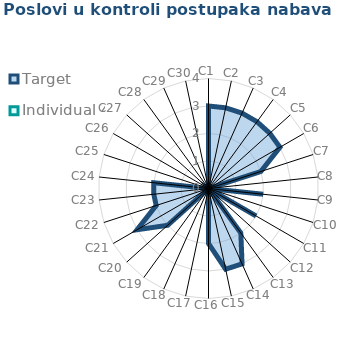
| Category | Target | Individual 4 |
|---|---|---|
| C1 | 3 | 0 |
| C2 | 3 | 0 |
| C3 | 3 | 0 |
| C4 | 3 | 0 |
| C5 | 3 | 0 |
| C6 | 3 | 0 |
| C7 | 2 | 0 |
| C8 | 0 | 0 |
| C9 | 2 | 0 |
| C10 | 0 | 0 |
| C11 | 2 | 0 |
| C12 | 0 | 0 |
| C13 | 2 | 0 |
| C14 | 3 | 0 |
| C15 | 3 | 0 |
| C16 | 2 | 0 |
| C17 | 0 | 0 |
| C18 | 0 | 0 |
| C19 | 0 | 0 |
| C20 | 2 | 0 |
| C21 | 3 | 0 |
| C22 | 2 | 0 |
| C23 | 2 | 0 |
| C24 | 2 | 0 |
| C25 | 0 | 0 |
| C26 | 0 | 0 |
| C27 | 0 | 0 |
| C28 | 0 | 0 |
| C29 | 0 | 0 |
| C30 | 0 | 0 |